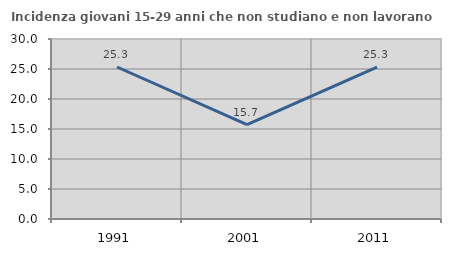
| Category | Incidenza giovani 15-29 anni che non studiano e non lavorano  |
|---|---|
| 1991.0 | 25.333 |
| 2001.0 | 15.718 |
| 2011.0 | 25.309 |